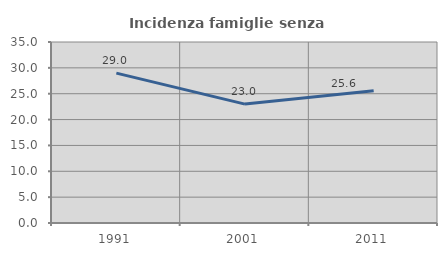
| Category | Incidenza famiglie senza nuclei |
|---|---|
| 1991.0 | 28.982 |
| 2001.0 | 22.992 |
| 2011.0 | 25.581 |